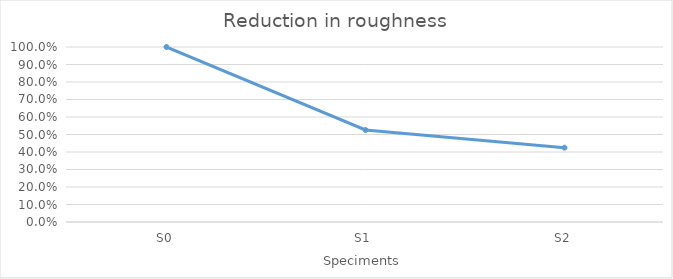
| Category | Roughness respect S0 |
|---|---|
| S0 | 1 |
| S1 | 0.526 |
| S2 | 0.425 |